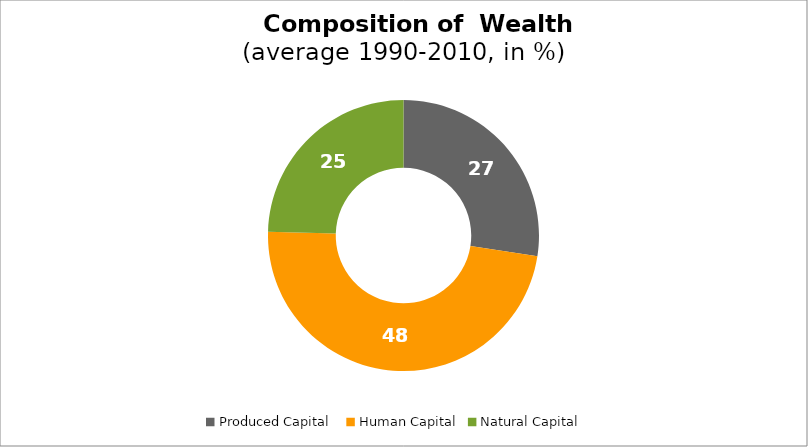
| Category | Series 0 |
|---|---|
| Produced Capital  | 27.459 |
| Human Capital | 47.988 |
| Natural Capital | 24.553 |